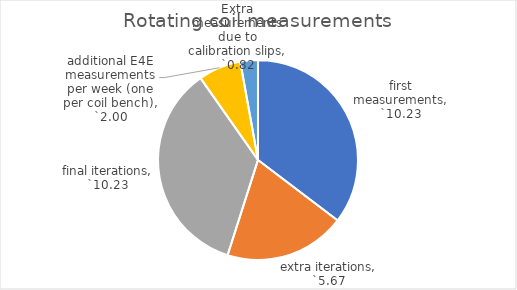
| Category | Rotating coil measurements |
|---|---|
| first measurements | 10.231 |
| extra iterations | 5.673 |
| final iterations | 10.231 |
| additional E4E measurements per week (one per coil bench) | 2 |
| Extra measurements due to calibration slips | 0.823 |